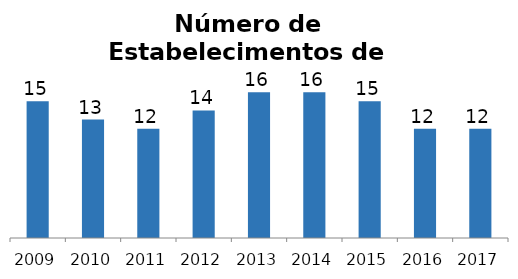
| Category | Agências de Viagem |
|---|---|
| 2009.0 | 15 |
| 2010.0 | 13 |
| 2011.0 | 12 |
| 2012.0 | 14 |
| 2013.0 | 16 |
| 2014.0 | 16 |
| 2015.0 | 15 |
| 2016.0 | 12 |
| 2017.0 | 12 |